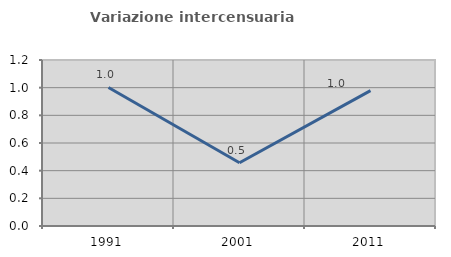
| Category | Variazione intercensuaria annua |
|---|---|
| 1991.0 | 1.001 |
| 2001.0 | 0.457 |
| 2011.0 | 0.978 |